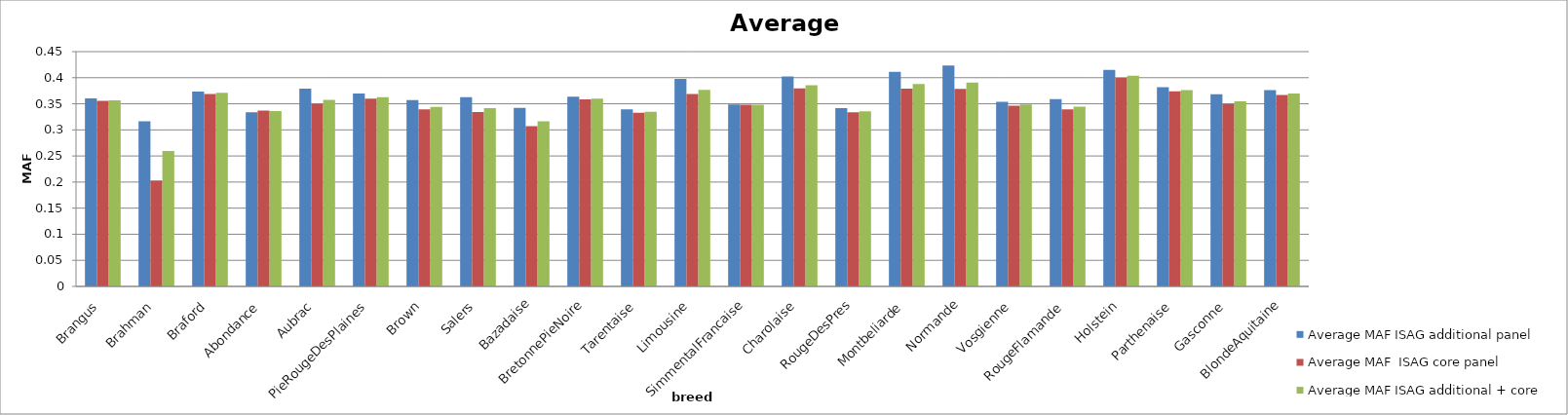
| Category | Average MAF ISAG additional panel | Average MAF  ISAG core panel | Average MAF ISAG additional + core panel |
|---|---|---|---|
| Brangus | 0.361 | 0.356 | 0.357 |
| Brahman | 0.316 | 0.203 | 0.26 |
| Braford | 0.374 | 0.369 | 0.371 |
| Abondance | 0.334 | 0.337 | 0.336 |
| Aubrac | 0.379 | 0.35 | 0.358 |
| PieRougeDesPlaines | 0.37 | 0.36 | 0.363 |
| Brown | 0.357 | 0.339 | 0.344 |
| Salers | 0.363 | 0.334 | 0.342 |
| Bazadaise | 0.342 | 0.307 | 0.317 |
| BretonnePieNoire | 0.364 | 0.358 | 0.36 |
| Tarentaise | 0.339 | 0.333 | 0.334 |
| Limousine | 0.398 | 0.369 | 0.377 |
| SimmentalFrancaise | 0.349 | 0.348 | 0.348 |
| Charolaise | 0.402 | 0.379 | 0.386 |
| RougeDesPres | 0.342 | 0.334 | 0.336 |
| Montbeliarde | 0.411 | 0.379 | 0.388 |
| Normande | 0.423 | 0.379 | 0.391 |
| Vosgienne | 0.354 | 0.347 | 0.349 |
| RougeFlamande | 0.359 | 0.339 | 0.345 |
| Holstein | 0.415 | 0.399 | 0.404 |
| Parthenaise | 0.382 | 0.374 | 0.376 |
| Gasconne | 0.368 | 0.35 | 0.355 |
| BlondeAquitaine | 0.376 | 0.367 | 0.37 |